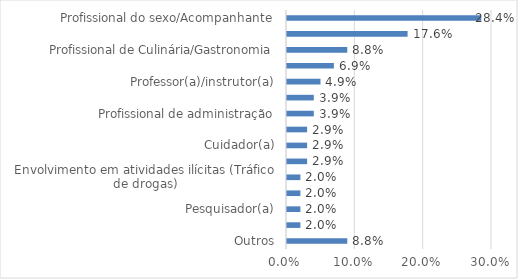
| Category | Series 0 |
|---|---|
| Outros | 0.088 |
| Profissional da saúde | 0.02 |
| Pesquisador(a) | 0.02 |
| Marketing/Publicidade | 0.02 |
| Envolvimento em atividades ilícitas (Tráfico de drogas) | 0.02 |
| Servidor(a) Público(a) | 0.029 |
| Cuidador(a) | 0.029 |
| Agente de prevenção/educador(a) social | 0.029 |
| Profissional de administração | 0.039 |
| Artista | 0.039 |
| Professor(a)/instrutor(a) | 0.049 |
| Profissional de comércio e vendas | 0.069 |
| Profissional de Culinária/Gastronomia | 0.088 |
| Profissional de estética e beleza | 0.176 |
| Profissional do sexo/Acompanhante | 0.284 |